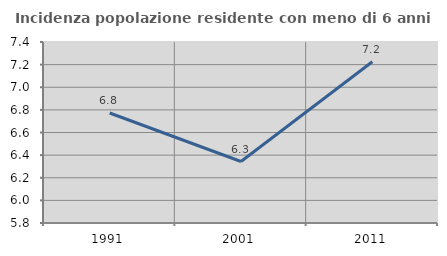
| Category | Incidenza popolazione residente con meno di 6 anni |
|---|---|
| 1991.0 | 6.772 |
| 2001.0 | 6.343 |
| 2011.0 | 7.226 |